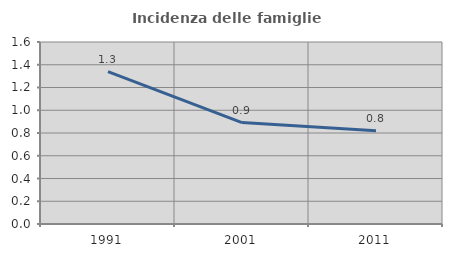
| Category | Incidenza delle famiglie numerose |
|---|---|
| 1991.0 | 1.34 |
| 2001.0 | 0.892 |
| 2011.0 | 0.82 |